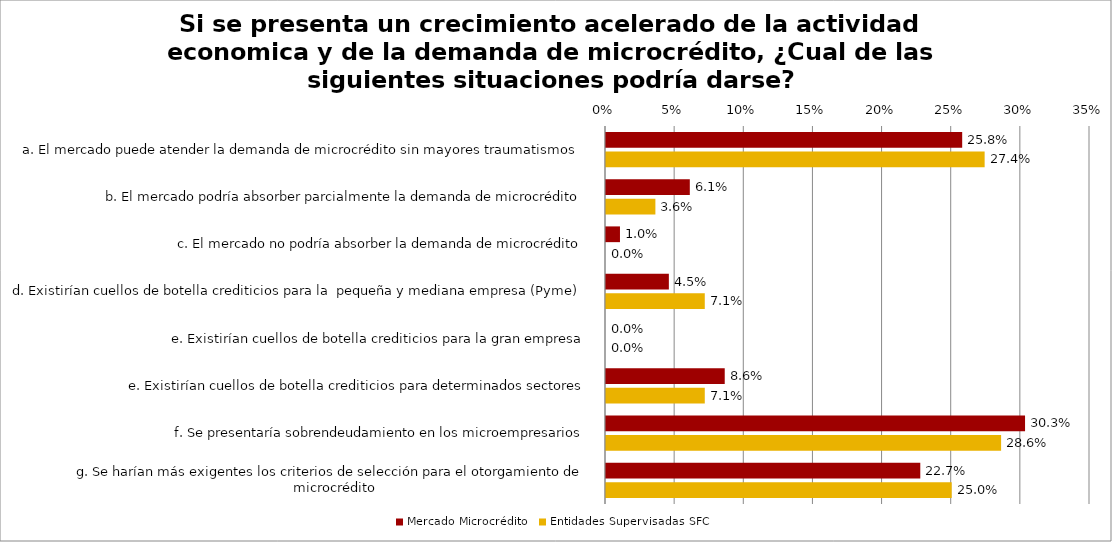
| Category | Mercado Microcrédito | Entidades Supervisadas SFC |
|---|---|---|
| a. El mercado puede atender la demanda de microcrédito sin mayores traumatismos | 0.258 | 0.274 |
| b. El mercado podría absorber parcialmente la demanda de microcrédito | 0.061 | 0.036 |
| c. El mercado no podría absorber la demanda de microcrédito | 0.01 | 0 |
| d. Existirían cuellos de botella crediticios para la  pequeña y mediana empresa (Pyme) | 0.045 | 0.071 |
| e. Existirían cuellos de botella crediticios para la gran empresa | 0 | 0 |
| e. Existirían cuellos de botella crediticios para determinados sectores | 0.086 | 0.071 |
| f. Se presentaría sobrendeudamiento en los microempresarios | 0.303 | 0.286 |
| g. Se harían más exigentes los criterios de selección para el otorgamiento de microcrédito | 0.227 | 0.25 |